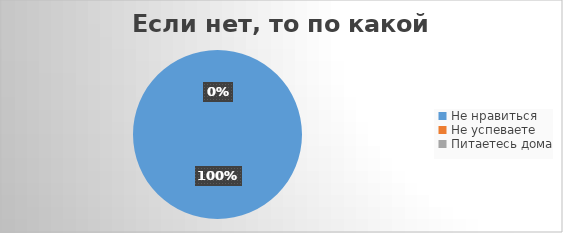
| Category | Series 0 |
|---|---|
| Не нравиться | 3 |
| Не успеваете | 0 |
| Питаетесь дома | 0 |